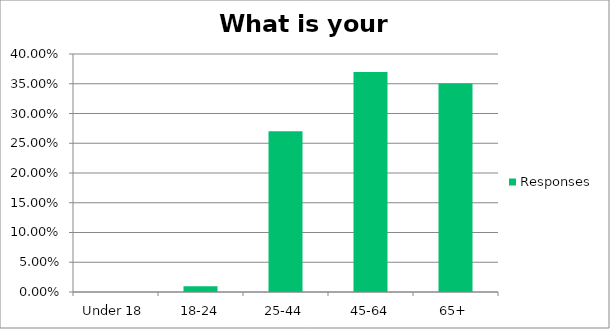
| Category | Responses |
|---|---|
| Under 18 | 0 |
| 18-24 | 0.01 |
| 25-44 | 0.27 |
| 45-64 | 0.37 |
| 65+ | 0.35 |